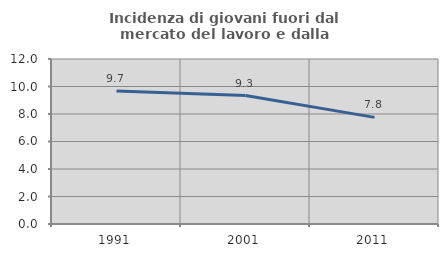
| Category | Incidenza di giovani fuori dal mercato del lavoro e dalla formazione  |
|---|---|
| 1991.0 | 9.677 |
| 2001.0 | 9.342 |
| 2011.0 | 7.755 |